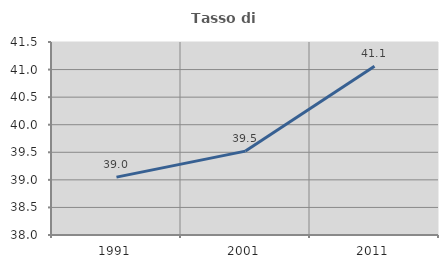
| Category | Tasso di occupazione   |
|---|---|
| 1991.0 | 39.05 |
| 2001.0 | 39.522 |
| 2011.0 | 41.058 |